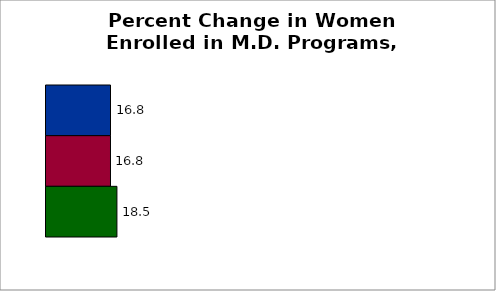
| Category | 50 states and D.C. | SREB states | State |
|---|---|---|---|
| 0 | 16.809 | 16.808 | 18.481 |